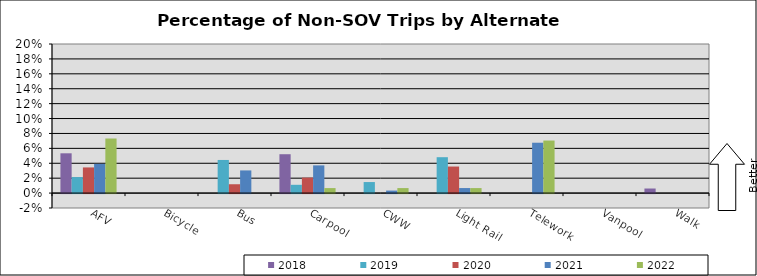
| Category | 2018 | 2019 | 2020 | 2021 | 2022 |
|---|---|---|---|---|---|
| AFV | 0.053 | 0.021 | 0.034 | 0.039 | 0.073 |
| Bicycle | 0 | 0 | 0 | 0 | 0 |
| Bus | 0 | 0.044 | 0.012 | 0.03 | 0 |
| Carpool | 0.052 | 0.011 | 0.021 | 0.037 | 0.007 |
| CWW | 0 | 0.015 | 0 | 0.003 | 0.007 |
| Light Rail | 0 | 0.048 | 0.036 | 0.007 | 0.007 |
| Telework | 0 | 0 | 0 | 0.068 | 0.07 |
| Vanpool | 0 | 0 | 0 | 0 | 0 |
| Walk | 0.006 | 0 | 0 | 0 | 0 |